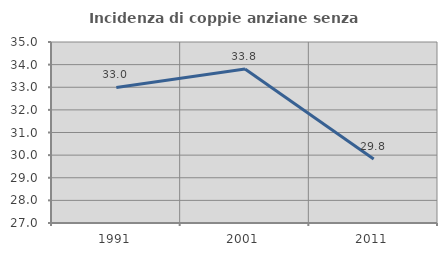
| Category | Incidenza di coppie anziane senza figli  |
|---|---|
| 1991.0 | 32.99 |
| 2001.0 | 33.803 |
| 2011.0 | 29.825 |